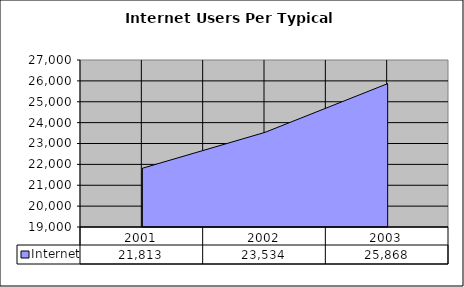
| Category | Internet |
|---|---|
| 2001.0 | 21813 |
| 2002.0 | 23534 |
| 2003.0 | 25868 |